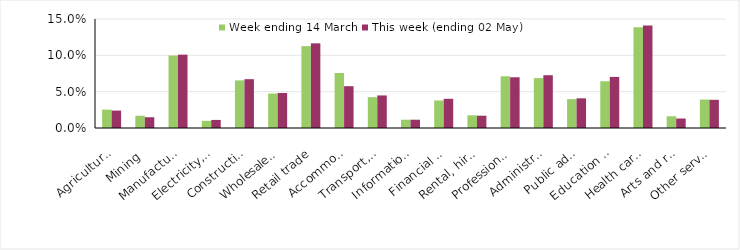
| Category | Week ending 14 March | This week (ending 02 May) |
|---|---|---|
| Agriculture, forestry and fishing | 0.025 | 0.024 |
| Mining | 0.017 | 0.015 |
| Manufacturing | 0.1 | 0.101 |
| Electricity, gas, water and waste services | 0.01 | 0.011 |
| Construction | 0.065 | 0.067 |
| Wholesale trade | 0.047 | 0.048 |
| Retail trade | 0.113 | 0.117 |
| Accommodation and food services | 0.076 | 0.058 |
| Transport, postal and warehousing | 0.042 | 0.045 |
| Information media and telecommunications | 0.011 | 0.011 |
| Financial and insurance services | 0.038 | 0.04 |
| Rental, hiring and real estate services | 0.017 | 0.017 |
| Professional, scientific and technical services | 0.071 | 0.07 |
| Administrative and support services | 0.069 | 0.073 |
| Public administration and safety | 0.04 | 0.041 |
| Education and training | 0.064 | 0.07 |
| Health care and social assistance | 0.139 | 0.141 |
| Arts and recreation services | 0.016 | 0.013 |
| Other services | 0.039 | 0.039 |